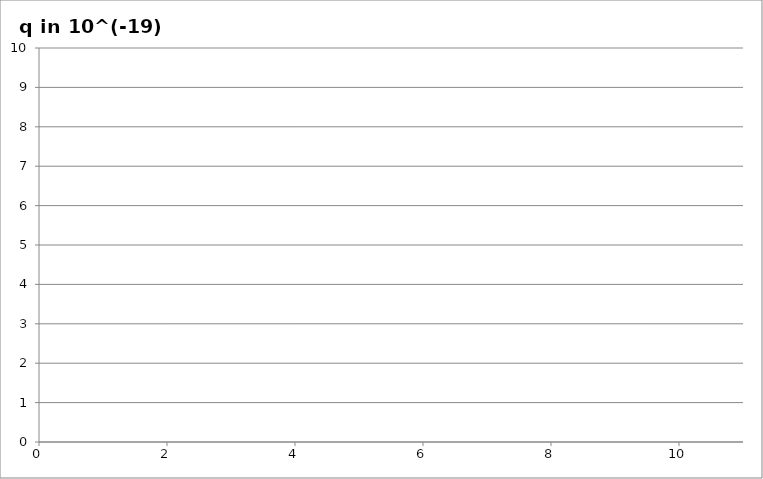
| Category | q in 10^(-19) C |
|---|---|
| 0 | 0 |
| 1 | 0 |
| 2 | 0 |
| 3 | 0 |
| 4 | 0 |
| 5 | 0 |
| 6 | 0 |
| 7 | 0 |
| 8 | 0 |
| 9 | 0 |